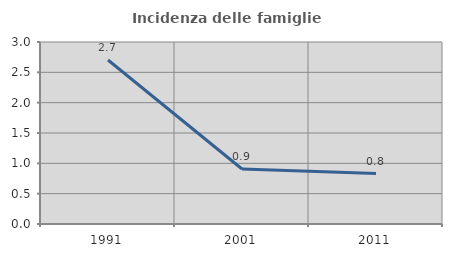
| Category | Incidenza delle famiglie numerose |
|---|---|
| 1991.0 | 2.703 |
| 2001.0 | 0.906 |
| 2011.0 | 0.831 |